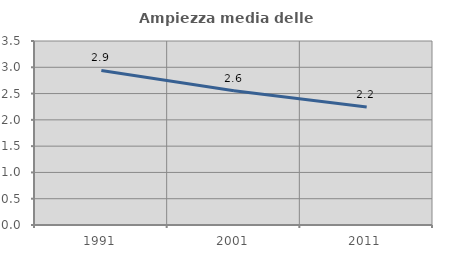
| Category | Ampiezza media delle famiglie |
|---|---|
| 1991.0 | 2.941 |
| 2001.0 | 2.555 |
| 2011.0 | 2.243 |